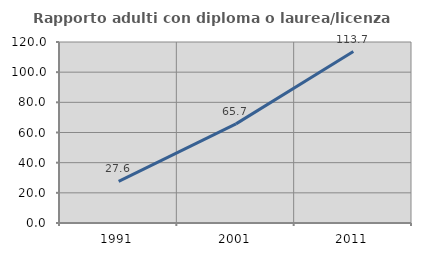
| Category | Rapporto adulti con diploma o laurea/licenza media  |
|---|---|
| 1991.0 | 27.6 |
| 2001.0 | 65.736 |
| 2011.0 | 113.692 |